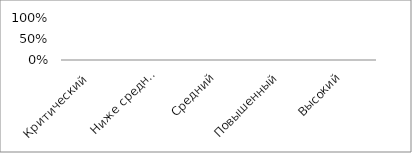
| Category | Series 0 |
|---|---|
| Критический  | 0 |
| Ниже среднего | 0 |
| Средний | 0 |
| Повышенный | 0 |
| Высокий | 0 |